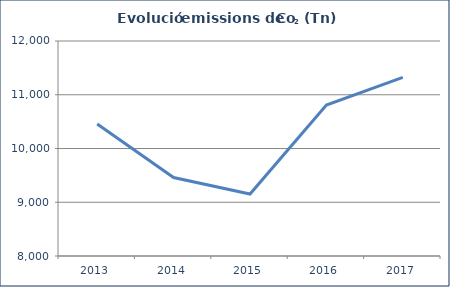
| Category | Co2 (Tn) |
|---|---|
| 2013.0 | 10456.132 |
| 2014.0 | 9460 |
| 2015.0 | 9152 |
| 2016.0 | 10808 |
| 2017.0 | 11324 |